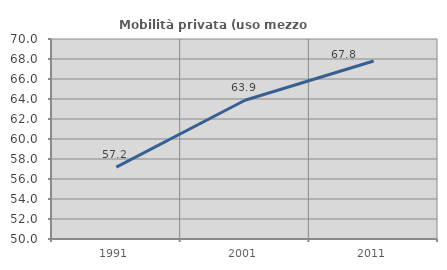
| Category | Mobilità privata (uso mezzo privato) |
|---|---|
| 1991.0 | 57.194 |
| 2001.0 | 63.879 |
| 2011.0 | 67.795 |